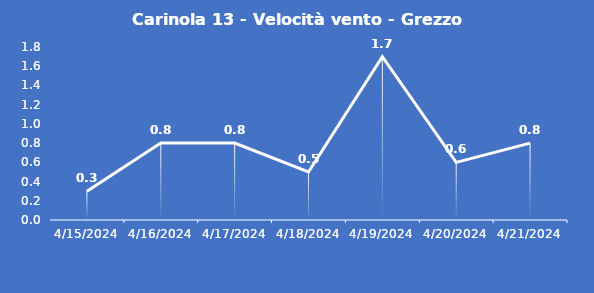
| Category | Carinola 13 - Velocità vento - Grezzo (m/s) |
|---|---|
| 4/15/24 | 0.3 |
| 4/16/24 | 0.8 |
| 4/17/24 | 0.8 |
| 4/18/24 | 0.5 |
| 4/19/24 | 1.7 |
| 4/20/24 | 0.6 |
| 4/21/24 | 0.8 |